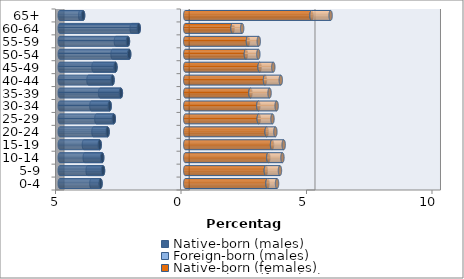
| Category | Native-born (males) | Foreign-born (males) | Native-born (females) | Foreign-born (females) |
|---|---|---|---|---|
| 0-4 | -3.376 | -0.364 | 3.277 | 0.381 |
| 5-9 | -3.277 | -0.612 | 3.21 | 0.563 |
| 10-14 | -3.31 | -0.695 | 3.31 | 0.563 |
| 15-19 | -3.409 | -0.629 | 3.459 | 0.463 |
| 20-24 | -3.094 | -0.563 | 3.243 | 0.348 |
| 25-29 | -2.846 | -0.695 | 2.929 | 0.546 |
| 30-34 | -3.012 | -0.728 | 2.912 | 0.728 |
| 35-39 | -2.565 | -0.827 | 2.598 | 0.761 |
| 40-44 | -2.896 | -0.96 | 3.177 | 0.629 |
| 45-49 | -2.78 | -0.877 | 2.962 | 0.546 |
| 50-54 | -2.234 | -0.662 | 2.416 | 0.496 |
| 55-59 | -2.284 | -0.48 | 2.499 | 0.43 |
| 60-64 | -1.853 | -0.281 | 1.886 | 0.381 |
| 65+ | -4.071 | -0.116 | 5.031 | 0.761 |